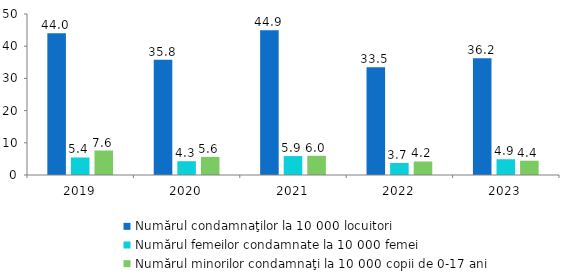
| Category | Numărul condamnaţilor la 10 000 locuitori | Numărul femeilor condamnate la 10 000 femei | Numărul minorilor condamnaţi la 10 000 copii de 0-17 ani |
|---|---|---|---|
| 2019.0 | 44.045 | 5.443 | 7.603 |
| 2020.0 | 35.792 | 4.289 | 5.622 |
| 2021.0 | 44.947 | 5.873 | 5.962 |
| 2022.0 | 33.469 | 3.72 | 4.197 |
| 2023.0 | 36.227 | 4.898 | 4.438 |